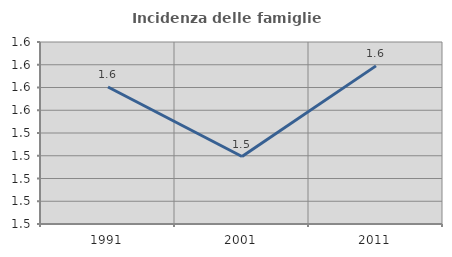
| Category | Incidenza delle famiglie numerose |
|---|---|
| 1991.0 | 1.58 |
| 2001.0 | 1.519 |
| 2011.0 | 1.599 |